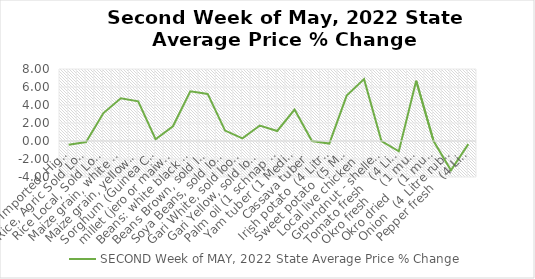
| Category | SECOND Week of MAY, 2022 |
|---|---|
| Rice, Imported, High Quality Sold loose  (1 mudu) | -0.406 |
| Rice, Agric Sold Loose(Low quality) imported  (1 mudu) | -0.113 |
| Rice Local, Sold Loose   (1 mudu) | 3.107 |
| Maize grain, white sold loose   (1 mudu) | 4.755 |
| Maize grain, yellow sold loose   (1 mudu) | 4.402 |
| Sorghum (Guinea Corn) white or brown, sold loose   (1 mudu) | 0.201 |
| millet (jero or maiwa) sold loose   (1 mudu) | 1.637 |
| Beans: white black eye. Sold loose   (1 mudu) | 5.525 |
| Beans Brown, sold loose  (1 mudu) | 5.233 |
| Soya Beans, sold loose    (1 mudu) | 1.158 |
| Gari White, sold loose  (1 mudu) | 0.288 |
| Gari Yellow, sold loose   (1 mudu) | 1.721 |
| Palm oil (1 schnap bottle) | 1.111 |
| Yam tuber (1 Medium Size) | 3.488 |
| Cassava tuber | 0 |
| Irish potato  (4 Litre rubber) | -0.281 |
| Sweet potato  (5 Medium Size) | 5.051 |
| Local live chicken  | 6.874 |
| Groundnut - shelled (fresh) | 0 |
| Tomato fresh   (4 Litre rubber) | -1.143 |
| Okro fresh     (1 mudu) | 6.704 |
| Okro dried    (1 mudu) | 0 |
| Onion   (4 Litre rubber) | -3.252 |
| Pepper fresh   (4 Litre rubber) | -0.345 |